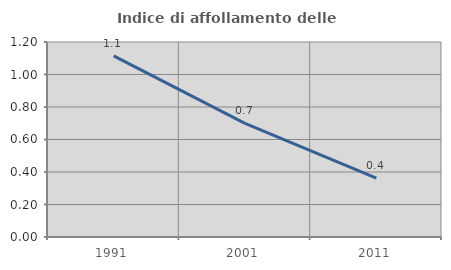
| Category | Indice di affollamento delle abitazioni  |
|---|---|
| 1991.0 | 1.114 |
| 2001.0 | 0.699 |
| 2011.0 | 0.362 |